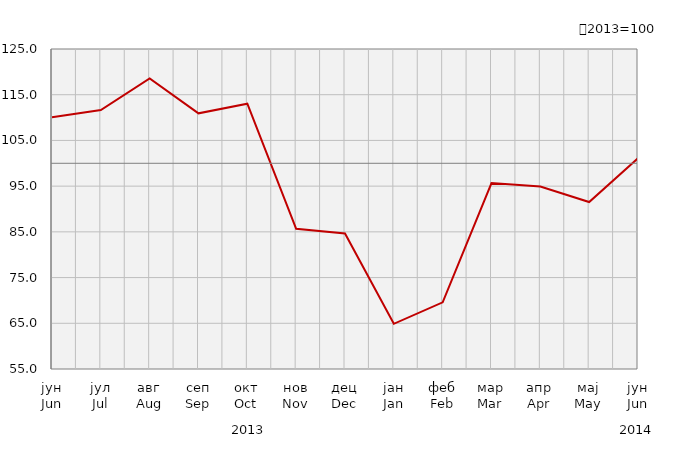
| Category | Индекси ноћења туриста
Tourist night indices |
|---|---|
| јун
Jun | 110.07 |
| јул
Jul | 111.646 |
| авг
Aug | 118.578 |
| сеп
Sep | 110.922 |
| окт
Oct | 113.026 |
| нов
Nov | 85.665 |
| дец
Dec | 84.657 |
| јан
Jan | 64.882 |
| феб
Feb | 69.586 |
| мар
Mar | 95.676 |
| апр
Apr | 94.927 |
| мај
May | 91.529 |
| јун
Jun | 101.092 |